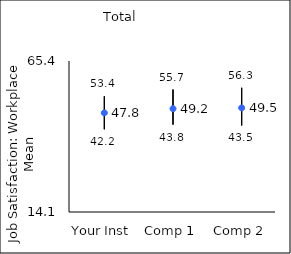
| Category | 25th percentile | 75th percentile | Mean |
|---|---|---|---|
| Your Inst | 42.2 | 53.4 | 47.78 |
| Comp 1 | 43.8 | 55.7 | 49.21 |
| Comp 2 | 43.5 | 56.3 | 49.48 |